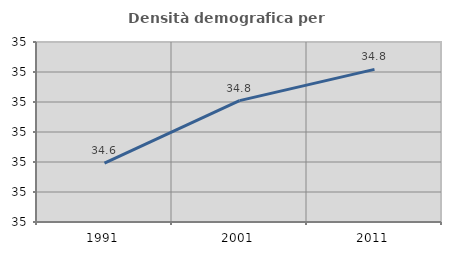
| Category | Densità demografica |
|---|---|
| 1991.0 | 34.648 |
| 2001.0 | 34.752 |
| 2011.0 | 34.804 |